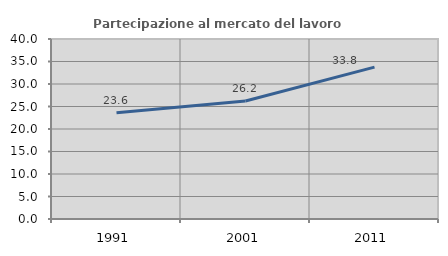
| Category | Partecipazione al mercato del lavoro  femminile |
|---|---|
| 1991.0 | 23.611 |
| 2001.0 | 26.217 |
| 2011.0 | 33.752 |